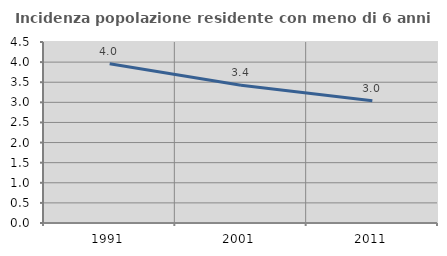
| Category | Incidenza popolazione residente con meno di 6 anni |
|---|---|
| 1991.0 | 3.959 |
| 2001.0 | 3.427 |
| 2011.0 | 3.038 |